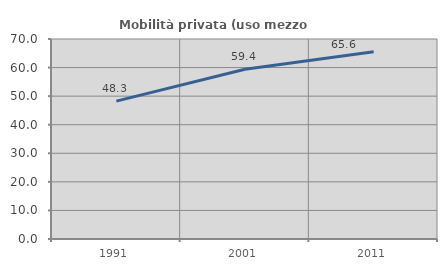
| Category | Mobilità privata (uso mezzo privato) |
|---|---|
| 1991.0 | 48.264 |
| 2001.0 | 59.429 |
| 2011.0 | 65.566 |